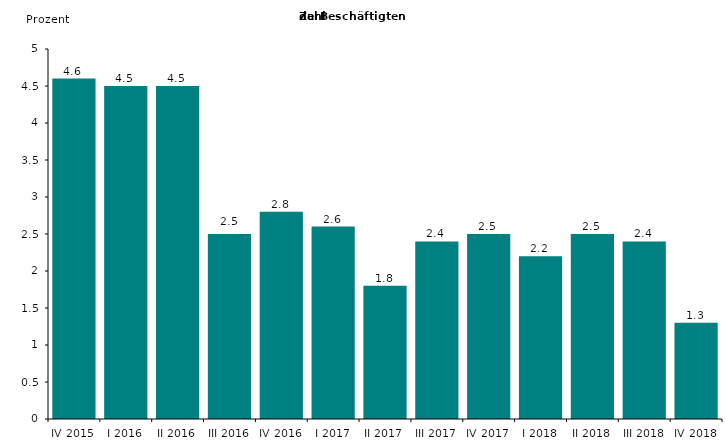
| Category | Series 0 |
|---|---|
| IV 2015 | 4.6 |
| I 2016 | 4.5 |
| II 2016 | 4.5 |
| III 2016 | 2.5 |
| IV 2016 | 2.8 |
| I 2017 | 2.6 |
| II 2017 | 1.8 |
| III 2017 | 2.4 |
| IV 2017 | 2.5 |
| I 2018 | 2.2 |
| II 2018 | 2.5 |
| III 2018 | 2.4 |
| IV 2018 | 1.3 |